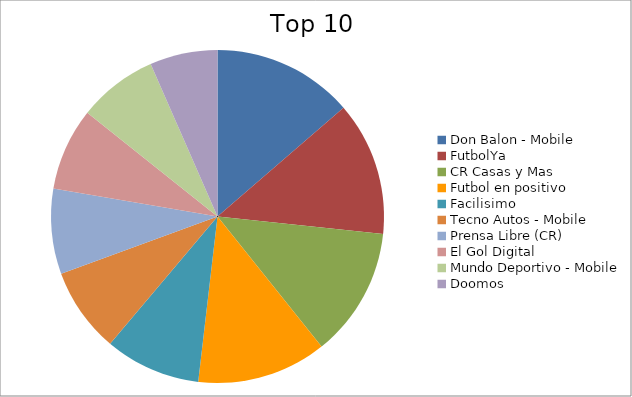
| Category | Series 0 |
|---|---|
| Don Balon - Mobile | 3.95 |
| FutbolYa | 3.76 |
| CR Casas y Mas | 3.64 |
| Futbol en positivo | 3.64 |
| Facilisimo | 2.69 |
| Tecno Autos - Mobile | 2.39 |
| Prensa Libre (CR) | 2.39 |
| El Gol Digital | 2.32 |
| Mundo Deportivo - Mobile | 2.23 |
| Doomos | 1.9 |